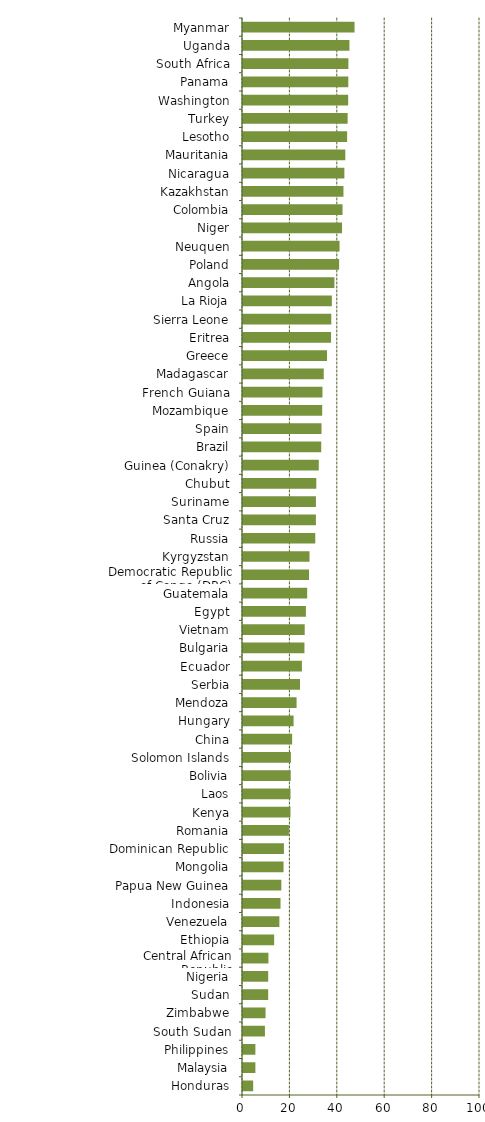
| Category | Series 0 |
|---|---|
| Honduras | 4.29 |
| Malaysia | 5.23 |
| Philippines | 5.23 |
| South Sudan | 9.25 |
| Zimbabwe | 9.51 |
| Sudan | 10.63 |
| Nigeria | 10.63 |
| Central African Republic | 10.73 |
| Ethiopia | 13.15 |
| Venezuela | 15.35 |
| Indonesia | 15.83 |
| Papua New Guinea | 16.17 |
| Mongolia | 17.11 |
| Dominican Republic | 17.27 |
| Romania | 19.37 |
| Kenya | 20.03 |
| Laos | 20.04 |
| Bolivia | 20.13 |
| Solomon Islands | 20.21 |
| China | 20.73 |
| Hungary | 21.35 |
| Mendoza | 22.61 |
| Serbia | 24.05 |
| Ecuador | 24.86 |
| Bulgaria | 25.93 |
| Vietnam | 26.04 |
| Egypt | 26.54 |
| Guatemala | 27.08 |
| Democratic Republic of Congo (DRC) | 27.85 |
| Kyrgyzstan | 28.07 |
| Russia | 30.49 |
| Santa Cruz | 30.76 |
| Suriname | 30.77 |
| Chubut | 30.93 |
| Guinea (Conakry) | 31.97 |
| Brazil | 33.01 |
| Spain | 33.13 |
| Mozambique | 33.41 |
| French Guiana | 33.53 |
| Madagascar | 34.07 |
| Greece | 35.45 |
| Eritrea | 37.15 |
| Sierra Leone | 37.25 |
| La Rioja | 37.49 |
| Angola | 38.57 |
| Poland | 40.56 |
| Neuquen | 40.74 |
| Niger | 41.79 |
| Colombia | 41.99 |
| Kazakhstan | 42.39 |
| Nicaragua | 42.77 |
| Mauritania | 43.17 |
| Lesotho | 43.93 |
| Turkey | 44.15 |
| Washington | 44.37 |
| Panama | 44.43 |
| South Africa | 44.47 |
| Uganda | 44.91 |
| Myanmar | 47.06 |